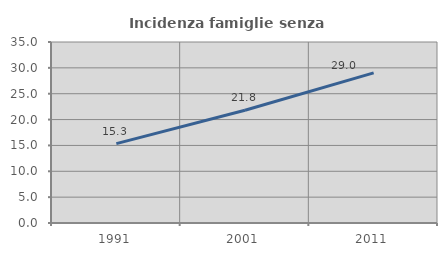
| Category | Incidenza famiglie senza nuclei |
|---|---|
| 1991.0 | 15.346 |
| 2001.0 | 21.793 |
| 2011.0 | 29.022 |